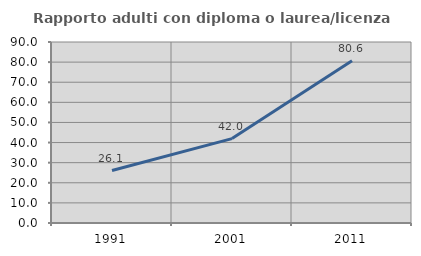
| Category | Rapporto adulti con diploma o laurea/licenza media  |
|---|---|
| 1991.0 | 26.087 |
| 2001.0 | 41.964 |
| 2011.0 | 80.645 |